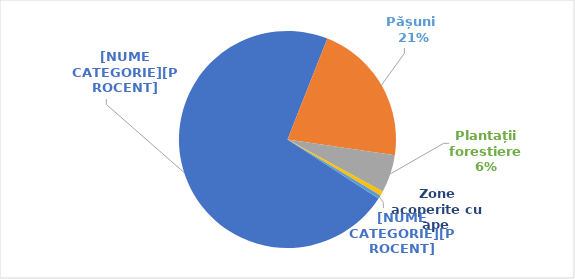
| Category | Hectare |
|---|---|
| Total terenuri agricole, din care:  | 525 |
| Pășuni  | 156 |
| Plantații forestiere  | 41 |
| Zone acoperite cu ape  | 5 |
| Ravene și alunecări de teren  | 4 |